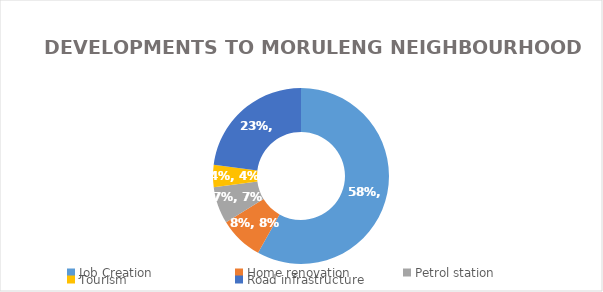
| Category | Series 0 |
|---|---|
| Job Creation | 0.581 |
| Home renovation | 0.081 |
| Petrol station | 0.068 |
| Tourism | 0.041 |
| Road infrastructure | 0.23 |